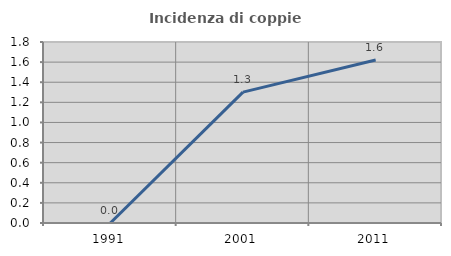
| Category | Incidenza di coppie miste |
|---|---|
| 1991.0 | 0 |
| 2001.0 | 1.302 |
| 2011.0 | 1.62 |